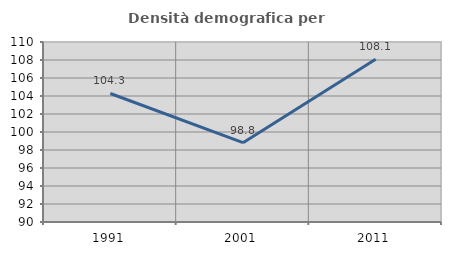
| Category | Densità demografica |
|---|---|
| 1991.0 | 104.278 |
| 2001.0 | 98.809 |
| 2011.0 | 108.081 |